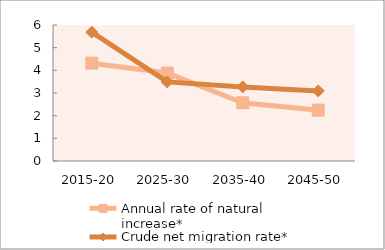
| Category | Annual rate of natural increase* | Crude net migration rate* |
|---|---|---|
| 2015-20 | 4.316 | 5.687 |
| 2025-30 | 3.88 | 3.489 |
| 2035-40 | 2.57 | 3.268 |
| 2045-50 | 2.242 | 3.092 |